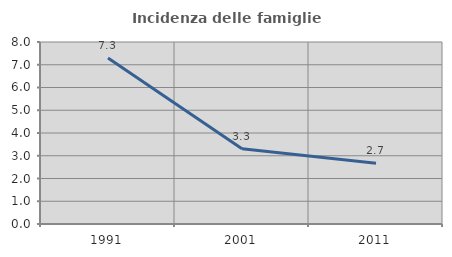
| Category | Incidenza delle famiglie numerose |
|---|---|
| 1991.0 | 7.292 |
| 2001.0 | 3.306 |
| 2011.0 | 2.674 |